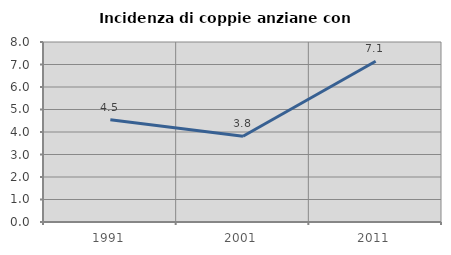
| Category | Incidenza di coppie anziane con figli |
|---|---|
| 1991.0 | 4.545 |
| 2001.0 | 3.81 |
| 2011.0 | 7.143 |